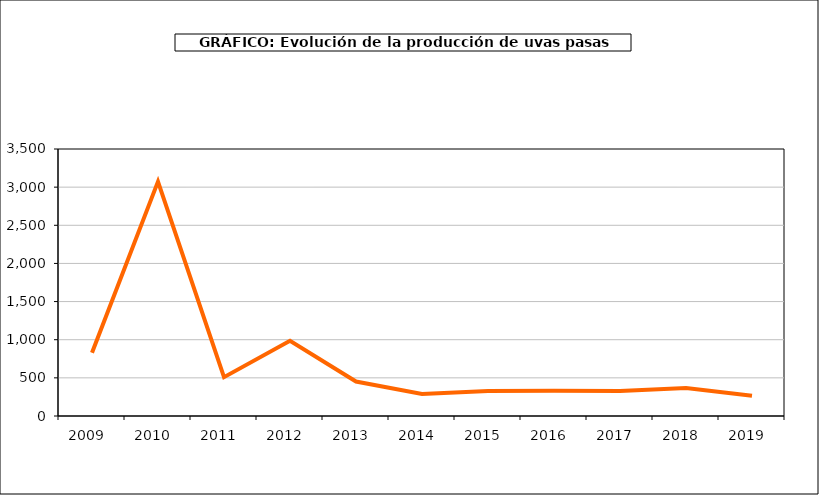
| Category | producción |
|---|---|
| 2009.0 | 828 |
| 2010.0 | 3073 |
| 2011.0 | 509 |
| 2012.0 | 986 |
| 2013.0 | 452 |
| 2014.0 | 289 |
| 2015.0 | 328 |
| 2016.0 | 332 |
| 2017.0 | 328 |
| 2018.0 | 368 |
| 2019.0 | 265 |